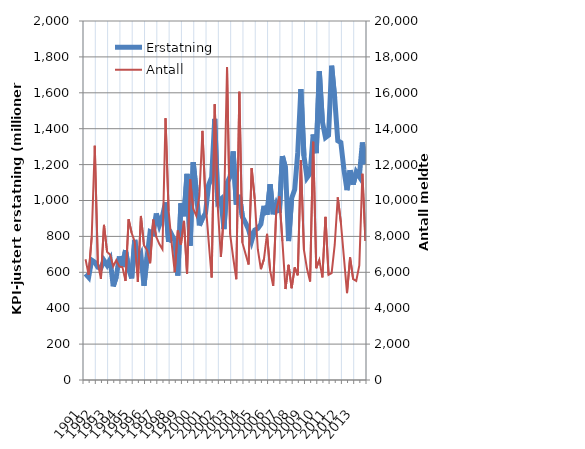
| Category | Erstatning |
|---|---|
| 1991.0 | 591.579 |
| nan | 572.287 |
| nan | 667.746 |
| nan | 656.396 |
| 1992.0 | 628.056 |
| nan | 624.045 |
| nan | 666.31 |
| nan | 639.591 |
| 1993.0 | 671.598 |
| nan | 521.577 |
| nan | 575.46 |
| nan | 688.697 |
| 1994.0 | 630.593 |
| nan | 723.392 |
| nan | 620.001 |
| nan | 566.075 |
| 1995.0 | 780.199 |
| nan | 659.448 |
| nan | 695.815 |
| nan | 524.742 |
| 1996.0 | 683.679 |
| nan | 825.944 |
| nan | 817.707 |
| nan | 927.833 |
| 1997.0 | 862.99 |
| nan | 912.615 |
| nan | 989.399 |
| nan | 769.195 |
| 1998.0 | 810.336 |
| nan | 776.529 |
| nan | 581.982 |
| nan | 984.311 |
| 1999.0 | 912.004 |
| nan | 1148.447 |
| nan | 748.195 |
| nan | 1212.986 |
| 2000.0 | 1051.918 |
| nan | 860.872 |
| nan | 900.019 |
| nan | 928.845 |
| 2001.0 | 1085.732 |
| nan | 1130.17 |
| nan | 1455.22 |
| nan | 991.747 |
| 2002.0 | 1007.298 |
| nan | 840.702 |
| nan | 1096.987 |
| nan | 1134.655 |
| 2003.0 | 1273.143 |
| nan | 977.282 |
| nan | 1031.625 |
| nan | 908.532 |
| 2004.0 | 876.233 |
| nan | 838.217 |
| nan | 775.153 |
| nan | 835.101 |
| 2005.0 | 844.15 |
| nan | 868.456 |
| nan | 970.181 |
| nan | 920.658 |
| 2006.0 | 1090.174 |
| nan | 923.351 |
| nan | 979.214 |
| nan | 931.506 |
| 2007.0 | 1247.432 |
| nan | 1181.709 |
| nan | 774.213 |
| nan | 1012.832 |
| 2008.0 | 1060.83 |
| nan | 1269.18 |
| nan | 1620.539 |
| nan | 1248.372 |
| 2009.0 | 1127.173 |
| nan | 1150.789 |
| nan | 1367.791 |
| nan | 1263.77 |
| 2010.0 | 1718.949 |
| nan | 1438.512 |
| nan | 1350.611 |
| nan | 1363.638 |
| 2011.0 | 1750.887 |
| nan | 1570.857 |
| nan | 1333.081 |
| nan | 1323.348 |
| 2012.0 | 1172.15 |
| nan | 1057.497 |
| nan | 1168.635 |
| nan | 1088.862 |
| 2013.0 | 1158.544 |
| nan | 1132.862 |
| nan | 1323.389 |
| nan | 1202.804 |